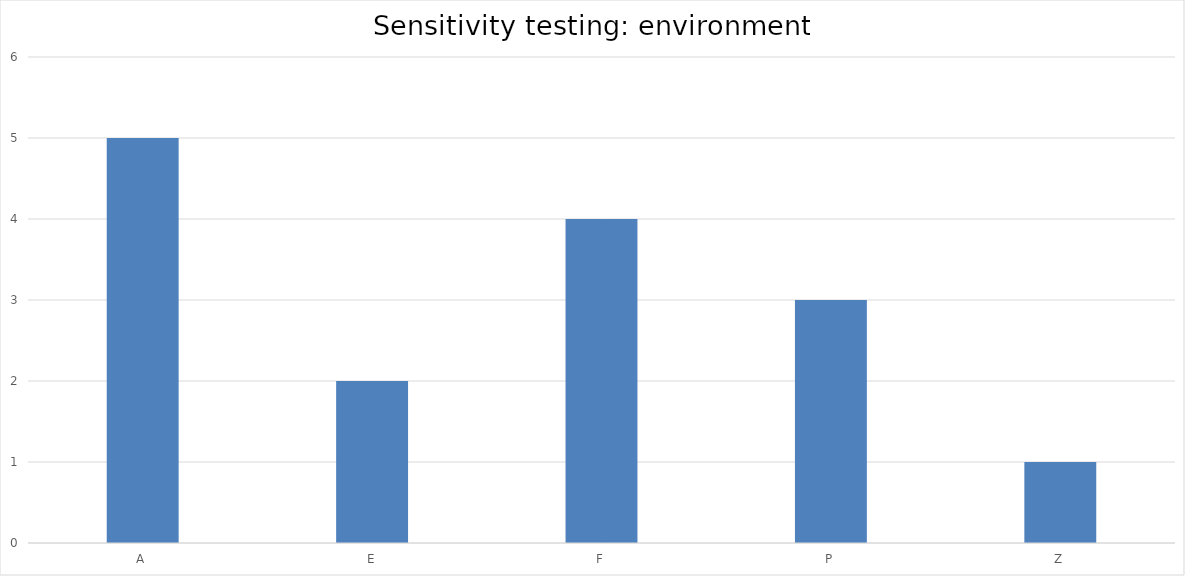
| Category | Series 0 |
|---|---|
| A | 5 |
| E | 2 |
| F | 4 |
| P | 3 |
| Z | 1 |